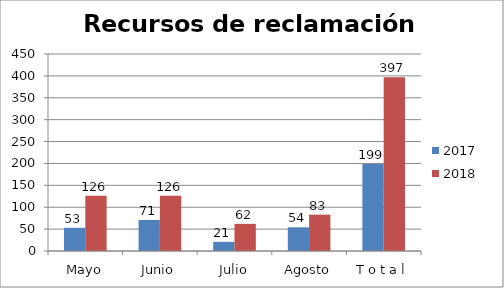
| Category | 2017 | 2018 |
|---|---|---|
| Mayo | 53 | 126 |
| Junio | 71 | 126 |
| Julio | 21 | 62 |
| Agosto | 54 | 83 |
| T o t a l | 199 | 397 |